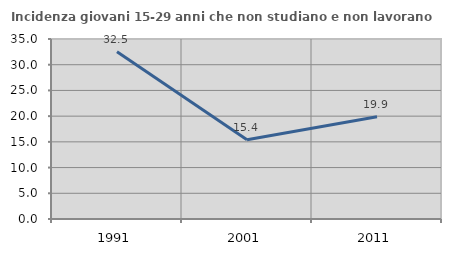
| Category | Incidenza giovani 15-29 anni che non studiano e non lavorano  |
|---|---|
| 1991.0 | 32.5 |
| 2001.0 | 15.423 |
| 2011.0 | 19.9 |